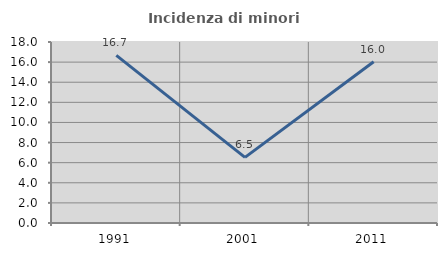
| Category | Incidenza di minori stranieri |
|---|---|
| 1991.0 | 16.667 |
| 2001.0 | 6.522 |
| 2011.0 | 16.038 |